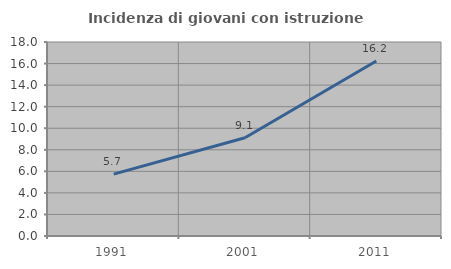
| Category | Incidenza di giovani con istruzione universitaria |
|---|---|
| 1991.0 | 5.741 |
| 2001.0 | 9.118 |
| 2011.0 | 16.243 |